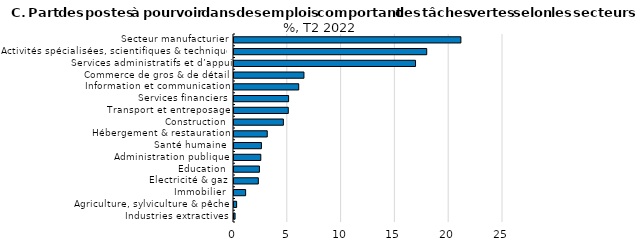
| Category | Share of green-task vacancies in % (2022 Q2) |
|---|---|
| Industries extractives | 0.1 |
| Agriculture, sylviculture & pêche | 0.245 |
| Immobilier | 1.081 |
| Électricité & gaz | 2.262 |
| Éducation | 2.364 |
| Administration publique | 2.491 |
| Santé humaine | 2.549 |
| Hébergement & restauration | 3.09 |
| Construction | 4.59 |
| Transport et entreposage | 5.045 |
| Services financiers | 5.075 |
| Information et communication | 6.016 |
| Commerce de gros & de détail | 6.5 |
| Services administratifs et d’appui | 16.872 |
| Activités spécialisées, scientifiques & techniques | 17.912 |
| Secteur manufacturier | 21.085 |